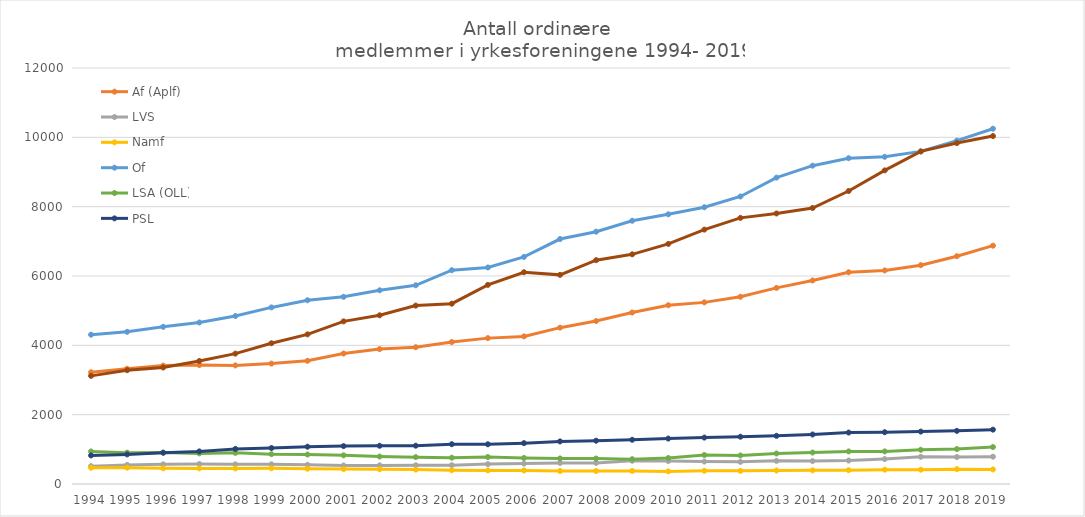
| Category | Af (Aplf) | LVS | Namf | Of | LSA (OLL) | PSL | Ylf |
|---|---|---|---|---|---|---|---|
| 1994 | 3224 | 515 | 468 | 4307 | 939 | 824 | 3119 |
| 1995 | 3324 | 551 | 471 | 4390 | 905 | 854 | 3283 |
| 1996 | 3416 | 567 | 452 | 4534 | 906 | 902 | 3361 |
| 1997 | 3431 | 577 | 450 | 4659 | 883 | 940 | 3549 |
| 1998 | 3421 | 567 | 449 | 4845 | 899 | 1011 | 3761 |
| 1999 | 3473 | 567 | 453 | 5094 | 860 | 1038 | 4060 |
| 2000 | 3554 | 555 | 442 | 5300 | 850 | 1076 | 4316 |
| 2001 | 3764 | 534 | 431 | 5400 | 826 | 1093 | 4691 |
| 2002 | 3891 | 537 | 425 | 5588 | 792 | 1103 | 4866 |
| 2003 | 3945 | 540 | 415 | 5732 | 774 | 1105 | 5146 |
| 2004 | 4095 | 543 | 397 | 6167 | 759 | 1148 | 5201 |
| 2005 | 4208 | 574 | 392 | 6246 | 777 | 1146 | 5744 |
| 2006 | 4258 | 589 | 391 | 6550 | 750 | 1179 | 6109 |
| 2007 | 4510 | 607 | 375 | 7066 | 737 | 1228 | 6033 |
| 2008 | 4702 | 609 | 375 | 7278 | 734 | 1249 | 6457 |
| 2009 | 4947 | 670 | 376 | 7593 | 716 | 1276 | 6625 |
| 2010 | 5157 | 662 | 364 | 7780 | 749 | 1311 | 6926 |
| 2011 | 5239 | 648 | 382 | 7983 | 836 | 1339 | 7338 |
| 2012 | 5401 | 639 | 379 | 8294 | 824 | 1364 | 7677 |
| 2013 | 5657 | 668 | 390 | 8838 | 880 | 1390 | 7804 |
| 2014 | 5871 | 661 | 394 | 9182 | 908 | 1428 | 7962 |
| 2015 | 6109 | 677 | 400 | 9399 | 940 | 1484 | 8451 |
| 2016 | 6160 | 719 | 413 | 9438 | 940 | 1494 | 9047 |
| 2017 | 6312 | 784 | 413 | 9595 | 987 | 1512 | 9594 |
| 2018 | 6571 | 778 | 428 | 9904 | 1008 | 1533 | 9834 |
| 2019 | 6875 | 788 | 420 | 10249 | 1066 | 1568 | 10037 |